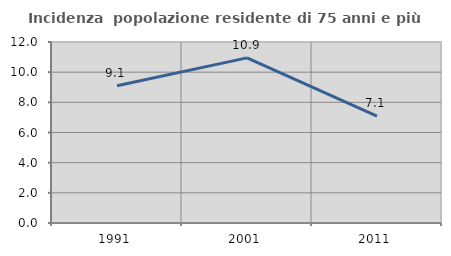
| Category | Incidenza  popolazione residente di 75 anni e più |
|---|---|
| 1991.0 | 9.104 |
| 2001.0 | 10.946 |
| 2011.0 | 7.082 |